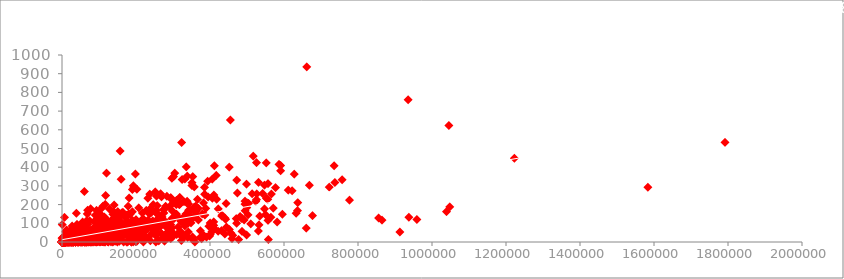
| Category | Votes Vs Revenue (Millions) |
|---|---|
| 757074.0 | 333.13 |
| 485820.0 | 126.46 |
| 157606.0 | 138.12 |
| 60545.0 | 270.32 |
| 393727.0 | 325.02 |
| 56036.0 | 45.13 |
| 258682.0 | 151.06 |
| 2490.0 | 0 |
| 7188.0 | 8.01 |
| 192177.0 | 100.01 |
| 232072.0 | 234.02 |
| 93103.0 | 169.27 |
| 323118.0 | 532.17 |
| 118151.0 | 248.75 |
| 8612.0 | 2.87 |
| 120259.0 | 368.31 |
| 211760.0 | 67.12 |
| 150823.0 | 162.16 |
| 102061.0 | 51.69 |
| 340798.0 | 100.5 |
| 19053.0 | 7.22 |
| 134213.0 | 47.7 |
| 1115.0 | 0 |
| 38552.0 | 153.69 |
| 127553.0 | 103.14 |
| 222.0 | 0 |
| 76193.0 | 6.5 |
| 523.0 | 0.01 |
| 66540.0 | 113.08 |
| 112813.0 | 54.65 |
| 48123.0 | 60.31 |
| 126030.0 | 10.64 |
| 275510.0 | 155.33 |
| 627797.0 | 363.02 |
| 46165.0 | 26.84 |
| 411656.0 | 408.08 |
| 1047747.0 | 187.99 |
| 293732.0 | 232.6 |
| 122853.0 | 93.38 |
| 241.0 | 0 |
| 120690.0 | 97.66 |
| 135095.0 | 27.85 |
| 496.0 | 0 |
| 37033.0 | 12.79 |
| 279.0 | 4.21 |
| 395025.0 | 241.06 |
| 17818.0 | 3.44 |
| 5103.0 | 0 |
| 164567.0 | 158.8 |
| 987.0 | 0 |
| 661608.0 | 936.63 |
| 41362.0 | 30.35 |
| 20221.0 | 32.46 |
| 321933.0 | 43 |
| 1791916.0 | 533.32 |
| 49190.0 | 7.08 |
| 121103.0 | 89.21 |
| 113322.0 | 56.23 |
| 3739.0 | 3.18 |
| 137608.0 | 125.07 |
| 472307.0 | 330.25 |
| 35870.0 | 0 |
| 102177.0 | 75.31 |
| 244474.0 | 166.15 |
| 913152.0 | 53.08 |
| 440209.0 | 128.25 |
| 39784.0 | 31.86 |
| 632842.0 | 153.63 |
| 291.0 | 0.01 |
| 89849.0 | 61.28 |
| 149791.0 | 0 |
| 78079.0 | 40.07 |
| 39134.0 | 3.73 |
| 43977.0 | 30.98 |
| 296853.0 | 341.26 |
| 498821.0 | 309.4 |
| 1045588.0 | 623.28 |
| 959065.0 | 120.52 |
| 552027.0 | 423.03 |
| 147717.0 | 128.34 |
| 1583625.0 | 292.57 |
| 105081.0 | 5.88 |
| 865134.0 | 116.87 |
| 636243.0 | 167.74 |
| 301249.0 | 350.03 |
| 455169.0 | 652.18 |
| 27869.0 | 10.38 |
| 935408.0 | 760.51 |
| 341170.0 | 54.12 |
| 162122.0 | 86.2 |
| 431185.0 | 60.96 |
| 187547.0 | 47.17 |
| 342429.0 | 169.71 |
| 106463.0 | 43.02 |
| 516895.0 | 458.99 |
| 175067.0 | 36.25 |
| 34110.0 | 4.68 |
| 9247.0 | 0.15 |
| 10181.0 | 1.29 |
| 937414.0 | 132.37 |
| 108836.0 | 1.87 |
| 570814.0 | 181.02 |
| 556097.0 | 228.43 |
| 7204.0 | 0 |
| 202973.0 | 45.43 |
| 115546.0 | 26.86 |
| 1954.0 | 1.66 |
| 117590.0 | 126.59 |
| 1004.0 | 0 |
| 339797.0 | 25.44 |
| 3712.0 | 10.16 |
| 486338.0 | 56.67 |
| 512.0 | 0 |
| 637104.0 | 210.59 |
| 590595.0 | 380.96 |
| 30761.0 | 54.73 |
| 50359.0 | 1.33 |
| 48969.0 | 11.15 |
| 192968.0 | 71.9 |
| 157026.0 | 486.29 |
| 101058.0 | 87.24 |
| 362093.0 | 150.83 |
| 53183.0 | 46.01 |
| 10428.0 | 0 |
| 1222645.0 | 448.13 |
| 198243.0 | 364 |
| 255483.0 | 245.43 |
| 69651.0 | 38.56 |
| 153481.0 | 143.7 |
| 499424.0 | 183.64 |
| 50953.0 | 57.64 |
| 109756.0 | 128 |
| 78328.0 | 55.12 |
| 477276.0 | 13.09 |
| 318051.0 | 238.67 |
| 200090.0 | 21.38 |
| 660286.0 | 74.27 |
| 386102.0 | 144.81 |
| 855604.0 | 127.97 |
| 13004.0 | 0 |
| 526324.0 | 257.7 |
| 34184.0 | 64 |
| 246360.0 | 70.24 |
| 224132.0 | 14.68 |
| 1039115.0 | 162.8 |
| 33418.0 | 2.01 |
| 47694.0 | 14.26 |
| 410249.0 | 107.5 |
| 442082.0 | 121.46 |
| 97623.0 | 34.26 |
| 50853.0 | 55.47 |
| 735604.0 | 408 |
| 4299.0 | 0.2 |
| 243230.0 | 46.88 |
| 1973.0 | 0 |
| 97618.0 | 41.8 |
| 400519.0 | 101.79 |
| 396714.0 | 84.24 |
| 291457.0 | 31.49 |
| 373244.0 | 23.62 |
| 5926.0 | 0 |
| 6946.0 | 1.8 |
| 552298.0 | 233.91 |
| 78043.0 | 58.4 |
| 495106.0 | 167.01 |
| 361449.0 | 191.45 |
| 156567.0 | 65.03 |
| 39723.0 | 33.31 |
| 76935.0 | 52.82 |
| 308981.0 | 200.07 |
| 332476.0 | 32.28 |
| 72778.0 | 48.02 |
| 2127.0 | 0 |
| 390531.0 | 25.56 |
| 451894.0 | 400.74 |
| 143069.0 | 93.42 |
| 337777.0 | 208.54 |
| 321442.0 | 110.42 |
| 137203.0 | 102.46 |
| 368912.0 | 180.19 |
| 43086.0 | 24.09 |
| 101781.0 | 25.14 |
| 117018.0 | 201.15 |
| 1176.0 | 0 |
| 22389.0 | 3.4 |
| 24003.0 | 0 |
| 11944.0 | 1.72 |
| 97454.0 | 31.06 |
| 461509.0 | 35.05 |
| 106364.0 | 110.01 |
| 27382.0 | 12.53 |
| 1445.0 | 0 |
| 268282.0 | 44.99 |
| 22107.0 | 3.91 |
| 355722.0 | 13.65 |
| 547368.0 | 176.64 |
| 3799.0 | 0 |
| 459304.0 | 18.35 |
| 532353.0 | 91.12 |
| 97082.0 | 127.38 |
| 471815.0 | 100.19 |
| 12193.0 | 8.1 |
| 79855.0 | 21.48 |
| 737719.0 | 318.3 |
| 70504.0 | 66 |
| 550011.0 | 146.41 |
| 5435.0 | 0.51 |
| 26089.0 | 2.14 |
| 227912.0 | 169.08 |
| 23713.0 | 0 |
| 161396.0 | 155.18 |
| 114290.0 | 14.12 |
| 531112.0 | 318.76 |
| 54679.0 | 0 |
| 443584.0 | 206.36 |
| 73568.0 | 31.14 |
| 542362.0 | 259.75 |
| 7044.0 | 33.04 |
| 1703.0 | 0 |
| 456749.0 | 48.04 |
| 61098.0 | 9.24 |
| 283445.0 | 244.05 |
| 136399.0 | 14.67 |
| 348551.0 | 102.52 |
| 334867.0 | 150.37 |
| 19660.0 | 0.66 |
| 121313.0 | 8.7 |
| 179450.0 | 52 |
| 268877.0 | 241.41 |
| 2382.0 | 0 |
| 498879.0 | 37.62 |
| 3305.0 | 0 |
| 247926.0 | 50.86 |
| 257472.0 | 195 |
| 66766.0 | 47.95 |
| 377336.0 | 17.74 |
| 41446.0 | 13.96 |
| 4895.0 | 2.41 |
| 530881.0 | 59.07 |
| 96852.0 | 26.62 |
| 332234.0 | 85.71 |
| 416689.0 | 356.45 |
| 1109.0 | 9.4 |
| 205365.0 | 89.73 |
| 148949.0 | 88.76 |
| 257426.0 | 148.78 |
| 382910.0 | 35.29 |
| 14708.0 | 5.66 |
| 188017.0 | 110.82 |
| 557965.0 | 13.18 |
| 178.0 | 0.32 |
| 50946.0 | 0.11 |
| 139831.0 | 161.03 |
| 342183.0 | 202.85 |
| 330305.0 | 137.39 |
| 611563.0 | 277.31 |
| 210349.0 | 65.17 |
| 422290.0 | 176.74 |
| 69823.0 | 67.24 |
| 664.0 | 2.27 |
| 440299.0 | 42.34 |
| 581518.0 | 106.95 |
| 21715.0 | 4.4 |
| 90556.0 | 0.79 |
| 59312.0 | 0.54 |
| 53441.0 | 0.03 |
| 75137.0 | 35.54 |
| 298651.0 | 27.1 |
| 388447.0 | 179.88 |
| 2384.0 | 0 |
| 547386.0 | 304.36 |
| 668651.0 | 303 |
| 432046.0 | 138.45 |
| 52144.0 | 3.23 |
| 4729.0 | 0 |
| 410125.0 | 89.02 |
| 280110.0 | 191.62 |
| 329683.0 | 33.05 |
| 36312.0 | 3.37 |
| 591023.0 | 408.99 |
| 492324.0 | 117.7 |
| 501769.0 | 209.02 |
| 220236.0 | 0 |
| 110773.0 | 12.71 |
| 122838.0 | 72.66 |
| 204874.0 | 36.38 |
| 30405.0 | 14.9 |
| 150121.0 | 47.38 |
| 26508.0 | 17.36 |
| 726.0 | 0 |
| 58782.0 | 2.13 |
| 226631.0 | 65 |
| 76327.0 | 55.29 |
| 96.0 | 0 |
| 577010.0 | 291.02 |
| 20514.0 | 18.71 |
| 34523.0 | 64.06 |
| 302268.0 | 124.73 |
| 43929.0 | 15.43 |
| 400682.0 | 40.22 |
| 249425.0 | 101.53 |
| 218996.0 | 125.07 |
| 295554.0 | 42.04 |
| 67033.0 | 48.24 |
| 105619.0 | 31.58 |
| 69509.0 | 8.09 |
| 57207.0 | 77.04 |
| 403.0 | 0 |
| 193479.0 | 62.49 |
| 59886.0 | 46.81 |
| 237221.0 | 255.95 |
| 103150.0 | 2.2 |
| 132580.0 | 0.92 |
| 385598.0 | 255.11 |
| 385325.0 | 292 |
| 199048.0 | 4.56 |
| 73093.0 | 34.91 |
| 1263.0 | 0 |
| 81429.0 | 65.07 |
| 300803.0 | 209.81 |
| 95960.0 | 65.27 |
| 616.0 | 0.01 |
| 203096.0 | 5.69 |
| 319025.0 | 37.55 |
| 510100.0 | 96.92 |
| 71149.0 | 27.36 |
| 37975.0 | 5.77 |
| 12643.0 | 0.04 |
| 62885.0 | 3.22 |
| 43085.0 | 7.1 |
| 34248.0 | 72.66 |
| 353305.0 | 350.12 |
| 352801.0 | 27.3 |
| 207497.0 | 182.2 |
| 339722.0 | 26.9 |
| 18201.0 | 0 |
| 564364.0 | 132.09 |
| 115.0 | 0 |
| 271301.0 | 124.87 |
| 93764.0 | 46.28 |
| 217464.0 | 155.02 |
| 452369.0 | 66.47 |
| 173320.0 | 73.1 |
| 36322.0 | 76.2 |
| 406219.0 | 336.53 |
| 92329.0 | 20.32 |
| 220664.0 | 38.35 |
| 379088.0 | 150.12 |
| 96617.0 | 16.2 |
| 320323.0 | 56.82 |
| 1396.0 | 0 |
| 97679.0 | 56.44 |
| 33352.0 | 2.02 |
| 45579.0 | 11.08 |
| 171970.0 | 130 |
| 59958.0 | 17.18 |
| 5496.0 | 0 |
| 299718.0 | 35.89 |
| 327838.0 | 101.47 |
| 221600.0 | 15.29 |
| 223065.0 | 100.47 |
| 14248.0 | 0.05 |
| 417663.0 | 228.76 |
| 409403.0 | 75.59 |
| 89059.0 | 30 |
| 677044.0 | 141.32 |
| 194329.0 | 292.3 |
| 286.0 | 0 |
| 474320.0 | 262.03 |
| 28326.0 | 26.38 |
| 702.0 | 3.85 |
| 335531.0 | 102.41 |
| 38430.0 | 14.27 |
| 312495.0 | 134.57 |
| 31776.0 | 27.37 |
| 7583.0 | 2.2 |
| 135706.0 | 62.56 |
| 175673.0 | 109.71 |
| 61812.0 | 4.21 |
| 137568.0 | 39.29 |
| 84016.0 | 3.33 |
| 169083.0 | 52.42 |
| 45867.0 | 0 |
| 217938.0 | 72.31 |
| 266508.0 | 257.76 |
| 154647.0 | 43.25 |
| 101092.0 | 78.75 |
| 221117.0 | 105.22 |
| 355362.0 | 132.55 |
| 220667.0 | 73.06 |
| 31913.0 | 20.57 |
| 31194.0 | 10.64 |
| 116112.0 | 17.75 |
| 102.0 | 0 |
| 114482.0 | 133.67 |
| 112288.0 | 42.48 |
| 342355.0 | 134.52 |
| 86417.0 | 109.18 |
| 26587.0 | 0 |
| 113686.0 | 113.71 |
| 159830.0 | 336.03 |
| 240.0 | 0 |
| 93972.0 | 0.1 |
| 410607.0 | 251.5 |
| 49041.0 | 26.76 |
| 40529.0 | 0.23 |
| 226661.0 | 95.72 |
| 316459.0 | 200.81 |
| 202380.0 | 281.67 |
| 74589.0 | 58.88 |
| 502961.0 | 145 |
| 108306.0 | 183.44 |
| 252119.0 | 268.49 |
| 35417.0 | 0 |
| 48161.0 | 21.2 |
| 34546.0 | 1.82 |
| 164.0 | 0 |
| 202890.0 | 50.92 |
| 357213.0 | 294.98 |
| 155010.0 | 4 |
| 164208.0 | 40.25 |
| 8914.0 | 0.04 |
| 35003.0 | 10.91 |
| 237887.0 | 106.37 |
| 100702.0 | 62.4 |
| 485075.0 | 127.49 |
| 122185.0 | 13.75 |
| 525700.0 | 227.14 |
| 43648.0 | 0 |
| 54216.0 | 79 |
| 238789.0 | 6.52 |
| 48297.0 | 28.84 |
| 494819.0 | 202.35 |
| 382459.0 | 209.36 |
| 223.0 | 0 |
| 81301.0 | 0.03 |
| 58421.0 | 37.43 |
| 156189.0 | 19 |
| 214825.0 | 28.75 |
| 220.0 | 0 |
| 181521.0 | 234.9 |
| 94977.0 | 38.32 |
| 156620.0 | 75.28 |
| 151409.0 | 9.7 |
| 4531.0 | 0 |
| 184152.0 | 46.98 |
| 213764.0 | 13.4 |
| 52331.0 | 5.2 |
| 309186.0 | 222.49 |
| 113272.0 | 35.27 |
| 556666.0 | 312.06 |
| 58720.0 | 1.82 |
| 126656.0 | 10.33 |
| 214994.0 | 98.9 |
| 202682.0 | 55.09 |
| 192263.0 | 0.61 |
| 241709.0 | 163.95 |
| 95119.0 | 90.35 |
| 182069.0 | 103.03 |
| 159736.0 | 22.88 |
| 294553.0 | 92.17 |
| 51235.0 | 35.79 |
| 8229.0 | 4.07 |
| 187760.0 | 0 |
| 57602.0 | 80.02 |
| 357436.0 | 186.83 |
| 255813.0 | 118.31 |
| 111558.0 | 1.01 |
| 556794.0 | 115.65 |
| 199900.0 | 119.22 |
| 337835.0 | 130.13 |
| 83941.0 | 15.96 |
| 297984.0 | 166.11 |
| 351059.0 | 301.96 |
| 481274.0 | 136.02 |
| 56332.0 | 15.79 |
| 278103.0 | 11.28 |
| 8404.0 | 0 |
| 61.0 | 0 |
| 41642.0 | 0 |
| 226619.0 | 62.88 |
| 93799.0 | 45.09 |
| 48400.0 | 12.63 |
| 17584.0 | 0 |
| 55781.0 | 107.51 |
| 254446.0 | 45.51 |
| 102954.0 | 118.82 |
| 84765.0 | 71.35 |
| 166489.0 | 53.85 |
| 504039.0 | 206.44 |
| 36091.0 | 0.02 |
| 241359.0 | 94.82 |
| 313803.0 | 80.03 |
| 44553.0 | 28.77 |
| 94707.0 | 2.61 |
| 565721.0 | 256.39 |
| 278379.0 | 179.02 |
| 298913.0 | 126.98 |
| 228339.0 | 73.34 |
| 722203.0 | 292.98 |
| 159364.0 | 81.69 |
| 77995.0 | 0.25 |
| 27428.0 | 0 |
| 52636.0 | 2.7 |
| 166872.0 | 0 |
| 291.0 | 0 |
| 107960.0 | 47.31 |
| 398972.0 | 32.39 |
| 83625.0 | 8.83 |
| 622089.0 | 274.08 |
| 144614.0 | 9.03 |
| 267820.0 | 46.98 |
| 170897.0 | 64.51 |
| 47289.0 | 66.01 |
| 42506.0 | 0 |
| 294950.0 | 58.4 |
| 137299.0 | 65.01 |
| 188769.0 | 31.57 |
| 513744.0 | 258.36 |
| 1356.0 | 0.05 |
| 24100.0 | 2.96 |
| 84927.0 | 16.97 |
| 1830.0 | 23.05 |
| 36156.0 | 0 |
| 36043.0 | 0.06 |
| 552.0 | 93.05 |
| 358932.0 | 0 |
| 26461.0 | 7.19 |
| 318058.0 | 200.66 |
| 245374.0 | 113.17 |
| 74674.0 | 7.46 |
| 12758.0 | 64.03 |
| 253858.0 | 0 |
| 352698.0 | 126.55 |
| 1024.0 | 1.08 |
| 143389.0 | 43.57 |
| 250811.0 | 58.68 |
| 24761.0 | 0.54 |
| 198.0 | 0 |
| 7115.0 | 0 |
| 137964.0 | 15.52 |
| 444417.0 | 79.24 |
| 27042.0 | 0 |
| 177247.0 | 53.68 |
| 4912.0 | 0 |
| 54787.0 | 3.71 |
| 10485.0 | 4.42 |
| 324898.0 | 334.19 |
| 391.0 | 0.11 |
| 22941.0 | 0 |
| 106381.0 | 118.68 |
| 17141.0 | 7.7 |
| 121847.0 | 56.11 |
| 9187.0 | 0 |
| 30074.0 | 0 |
| 30180.0 | 35.39 |
| 96688.0 | 43.77 |
| 148504.0 | 55.94 |
| 90372.0 | 24.99 |
| 115355.0 | 0.44 |
| 283282.0 | 102.98 |
| 133113.0 | 54.24 |
| 171169.0 | 48.06 |
| 290559.0 | 189.41 |
| 239772.0 | 155.11 |
| 47804.0 | 34.96 |
| 338369.0 | 352.36 |
| 432461.0 | 143.49 |
| 26521.0 | 4.2 |
| 68654.0 | 41.01 |
| 110825.0 | 83.91 |
| 150353.0 | 127.71 |
| 159582.0 | 75.27 |
| 374044.0 | 59.89 |
| 11900.0 | 4.85 |
| 238206.0 | 163.19 |
| 44425.0 | 27.55 |
| 273959.0 | 172.05 |
| 525646.0 | 424.65 |
| 44158.0 | 0.58 |
| 6809.0 | 131.56 |
| 125129.0 | 0 |
| 89885.0 | 38.54 |
| 60059.0 | 41.1 |
| 297395.0 | 75.61 |
| 190673.0 | 115.8 |
| 114006.0 | 115.6 |
| 142900.0 | 83.5 |
| 199860.0 | 3.68 |
| 293941.0 | 237.28 |
| 182074.0 | 10.1 |
| 25208.0 | 0.32 |
| 116118.0 | 10.72 |
| 122864.0 | 2.34 |
| 68306.0 | 150.32 |
| 97141.0 | 12.13 |
| 84083.0 | 24.85 |
| 63408.0 | 6.86 |
| 277123.0 | 5.01 |
| 183926.0 | 148.34 |
| 181432.0 | 46 |
| 40357.0 | 93.95 |
| 137684.0 | 0 |
| 89791.0 | 143.52 |
| 1630.0 | 6.53 |
| 338.0 | 0 |
| 116435.0 | 0 |
| 368556.0 | 117.53 |
| 33560.0 | 3.49 |
| 216932.0 | 75.75 |
| 71822.0 | 19.45 |
| 24387.0 | 1.48 |
| 130702.0 | 43.98 |
| 143564.0 | 3.9 |
| 199973.0 | 24.48 |
| 21089.0 | 0.04 |
| 277.0 | 20.76 |
| 29895.0 | 0 |
| 30053.0 | 0.03 |
| 249877.0 | 58.23 |
| 66400.0 | 17.47 |
| 127157.0 | 62.32 |
| 94069.0 | 0.4 |
| 78631.0 | 65 |
| 144715.0 | 89.25 |
| 210965.0 | 58.88 |
| 406540.0 | 234.36 |
| 7181.0 | 0 |
| 10700.0 | 0 |
| 74886.0 | 113.73 |
| 151519.0 | 32.36 |
| 261536.0 | 6.11 |
| 73491.0 | 2.2 |
| 6683.0 | 0 |
| 776897.0 | 223.81 |
| 309398.0 | 148.73 |
| 404884.0 | 54.7 |
| 195360.0 | 37.4 |
| 50402.0 | 31.54 |
| 178471.0 | 56.72 |
| 361105.0 | 162.59 |
| 110100.0 | 3.08 |
| 31149.0 | 0 |
| 4304.0 | 0.86 |
| 3564.0 | 0 |
| 595779.0 | 148.09 |
| 76469.0 | 13.65 |
| 173.0 | 0 |
| 27006.0 | 0.03 |
| 44111.0 | 7.79 |
| 296289.0 | 52.88 |
| 36300.0 | 0 |
| 219916.0 | 53.99 |
| 30875.0 | 9.39 |
| 482.0 | 0 |
| 240323.0 | 97.03 |
| 286722.0 | 25.36 |
| 178527.0 | 190.87 |
| 198006.0 | 17.11 |
| 2798.0 | 0.03 |
| 267872.0 | 87.34 |
| 54027.0 | 0.02 |
| 206707.0 | 20.3 |
| 140151.0 | 159.58 |
| 5796.0 | 0.28 |
| 75291.0 | 12.8 |
| 26320.0 | 0.05 |
| 136323.0 | 81.26 |
| 168875.0 | 49.87 |
| 422014.0 | 57.37 |
| 15514.0 | 0 |
| 47703.0 | 1.21 |
| 352023.0 | 15.7 |
| 231907.0 | 116.59 |
| 9285.0 | 0 |
| 233346.0 | 25.59 |
| 188004.0 | 25.12 |
| 80415.0 | 0.01 |
| 57874.0 | 34.02 |
| 2403.0 | 0.54 |
| 331902.0 | 337.1 |
| 104953.0 | 1.74 |
| 16164.0 | 14.01 |
| 112313.0 | 31.17 |
| 245144.0 | 69.95 |
| 534388.0 | 138.8 |
| 54486.0 | 0.15 |
| 252503.0 | 80.17 |
| 586669.0 | 414.98 |
| 157053.0 | 24.1 |
| 114144.0 | 42.35 |
| 23540.0 | 1.4 |
| 10708.0 | 1.36 |
| 90188.0 | 23.22 |
| 471109.0 | 124.98 |
| 177602.0 | 0 |
| 19636.0 | 0.2 |
| 86271.0 | 0.33 |
| 347567.0 | 134.52 |
| 1427.0 | 0 |
| 73835.0 | 1.29 |
| 494641.0 | 218.63 |
| 250012.0 | 90.36 |
| 106115.0 | 49.55 |
| 83788.0 | 23.23 |
| 4754.0 | 0 |
| 208632.0 | 62.45 |
| 5908.0 | 1.02 |
| 146812.0 | 47.11 |
| 18437.0 | 5.73 |
| 335757.0 | 402.08 |
| 11482.0 | 0.92 |
| 50388.0 | 50.15 |
| 92863.0 | 6.86 |
| 74664.0 | 36.77 |
| 141141.0 | 197.99 |
| 64557.0 | 32.36 |
| 96718.0 | 52.53 |
| 209700.0 | 101.16 |
| 236500.0 | 150.06 |
| 65824.0 | 0.33 |
| 95553.0 | 37.88 |
| 190385.0 | 162 |
| 26088.0 | 20.75 |
| 127983.0 | 176.59 |
| 209326.0 | 79.71 |
| 286543.0 | 55.8 |
| 309934.0 | 39.83 |
| 219116.0 | 77.21 |
| 71069.0 | 0.32 |
| 166342.0 | 44.67 |
| 201707.0 | 37.37 |
| 688.0 | 0 |
| 338280.0 | 217.54 |
| 16163.0 | 0.69 |
| 259182.0 | 73.82 |
| 4155.0 | 0.02 |
| 182305.0 | 39.38 |
| 17439.0 | 0.56 |
| 124554.0 | 102.18 |
| 29642.0 | 63.03 |
| 8998.0 | 4.71 |
| 144524.0 | 20.17 |
| 254904.0 | 171.03 |
| 25903.0 | 3.59 |
| 144779.0 | 42.62 |
| 313.0 | 0 |
| 3731.0 | 3.65 |
| 30035.0 | 34.9 |
| 91684.0 | 68.56 |
| 148943.0 | 39 |
| 92875.0 | 27.69 |
| 322536.0 | 7.76 |
| 154400.0 | 54.76 |
| 353.0 | 0 |
| 187302.0 | 0.06 |
| 2083.0 | 0 |
| 256.0 | 0 |
| 84893.0 | 21.27 |
| 290056.0 | 93.57 |
| 91229.0 | 31.66 |
| 151970.0 | 31.24 |
| 57826.0 | 18.7 |
| 156158.0 | 101.11 |
| 154588.0 | 64.42 |
| 103279.0 | 10.57 |
| 194236.0 | 61.66 |
| 351361.0 | 317.01 |
| 72515.0 | 31.99 |
| 25928.0 | 0.34 |
| 347798.0 | 168.37 |
| 2043.0 | 0 |
| 523893.0 | 217.39 |
| 82701.0 | 42.27 |
| 199193.0 | 10.14 |
| 110490.0 | 191.45 |
| 10871.0 | 0.78 |
| 9026.0 | 0 |
| 499.0 | 0 |
| 29912.0 | 3.86 |
| 218679.0 | 61.09 |
| 67196.0 | 12.28 |
| 128146.0 | 28.48 |
| 1031.0 | 0 |
| 31370.0 | 0.04 |
| 346154.0 | 107.1 |
| 378.0 | 0 |
| 11555.0 | 3.77 |
| 69157.0 | 169.69 |
| 366138.0 | 227.95 |
| 50241.0 | 87.03 |
| 92868.0 | 36.92 |
| 154936.0 | 31.45 |
| 4370.0 | 0.29 |
| 129252.0 | 18.6 |
| 178243.0 | 70.63 |
| 87887.0 | 5.48 |
| 304837.0 | 368.05 |
| 93883.0 | 25.98 |
| 199813.0 | 26 |
| 7091.0 | 0 |
| 196652.0 | 14.99 |
| 146566.0 | 82.16 |
| 103681.0 | 50.55 |
| 221073.0 | 71.98 |
| 52537.0 | 33.63 |
| 233148.0 | 90.76 |
| 115751.0 | 6.85 |
| 4771.0 | 3.9 |
| 4964.0 | 0 |
| 19309.0 | 0.05 |
| 142560.0 | 71.59 |
| 153448.0 | 41.57 |
| 72050.0 | 16.68 |
| 149779.0 | 21 |
| 285441.0 | 88.5 |
| 8755.0 | 0 |
| 294010.0 | 18.33 |
| 91106.0 | 84.26 |
| 564.0 | 0 |
| 13711.0 | 0 |
| 130153.0 | 7.69 |
| 180105.0 | 150.17 |
| 5855.0 | 0.3 |
| 4779.0 | 0 |
| 1427.0 | 0 |
| 5715.0 | 6.88 |
| 1391.0 | 0 |
| 160350.0 | 25.03 |
| 77207.0 | 14.17 |
| 171356.0 | 70.27 |
| 16917.0 | 49 |
| 67464.0 | 11.23 |
| 62719.0 | 70.22 |
| 225394.0 | 59.62 |
| 38804.0 | 5.98 |
| 5531.0 | 0.13 |
| 163144.0 | 100.02 |
| 8409.0 | 0 |
| 346.0 | 0 |
| 125190.0 | 54.41 |
| 15232.0 | 1.98 |
| 137117.0 | 3.03 |
| 95480.0 | 104.37 |
| 157499.0 | 81.56 |
| 276347.0 | 93.75 |
| 77447.0 | 177.34 |
| 77986.0 | 0.09 |
| 1066.0 | 0 |
| 69659.0 | 95 |
| 198395.0 | 81.16 |
| 111875.0 | 16.17 |
| 88829.0 | 11.33 |
| 208770.0 | 23.21 |
| 329788.0 | 215.4 |
| 9993.0 | 54.01 |
| 297093.0 | 125.32 |
| 55648.0 | 36.58 |
| 136642.0 | 41.78 |
| 206793.0 | 35.71 |
| 119376.0 | 19.06 |
| 2421.0 | 0 |
| 32310.0 | 66.95 |
| 100890.0 | 1.36 |
| 6175.0 | 0 |
| 61060.0 | 0.16 |
| 7402.0 | 3.4 |
| 20907.0 | 0.64 |
| 20194.0 | 52.69 |
| 270429.0 | 133.38 |
| 21569.0 | 3.36 |
| 59512.0 | 9.35 |
| 64584.0 | 44.8 |
| 113599.0 | 13.77 |
| 101301.0 | 53.36 |
| 221858.0 | 28.64 |
| 193579.0 | 66.36 |
| 160592.0 | 33.4 |
| 152145.0 | 122.51 |
| 159230.0 | 83.64 |
| 8365.0 | 1.91 |
| 125693.0 | 83.3 |
| 184564.0 | 23.01 |
| 173919.0 | 143.62 |
| 16361.0 | 0.03 |
| 253417.0 | 34.3 |
| 143517.0 | 13.3 |
| 82874.0 | 60.44 |
| 75262.0 | 25 |
| 281625.0 | 34.96 |
| 202.0 | 0 |
| 108156.0 | 67.52 |
| 264480.0 | 85.46 |
| 102547.0 | 152.64 |
| 187077.0 | 42.72 |
| 174553.0 | 0 |
| 61274.0 | 34.53 |
| 93036.0 | 2.28 |
| 172558.0 | 88.92 |
| 83976.0 | 58.72 |
| 27730.0 | 0.81 |
| 118905.0 | 34.01 |
| 55243.0 | 3.45 |
| 237565.0 | 177 |
| 190833.0 | 58.61 |
| 1455.0 | 0 |
| 12361.0 | 14.44 |
| 269581.0 | 117.14 |
| 64351.0 | 7.77 |
| 187004.0 | 75.64 |
| 17565.0 | 0.08 |
| 4204.0 | 0 |
| 117297.0 | 82.23 |
| 66265.0 | 0.07 |
| 33007.0 | 36.84 |
| 17962.0 | 0.79 |
| 257395.0 | 85.02 |
| 19351.0 | 0 |
| 199387.0 | 2.21 |
| 155078.0 | 70.08 |
| 67801.0 | 0.12 |
| 31651.0 | 3.64 |
| 152808.0 | 64.15 |
| 57921.0 | 27.29 |
| 246797.0 | 200.07 |
| 190244.0 | 281.28 |
| 91623.0 | 47.54 |
| 7475.0 | 0.02 |
| 3843.0 | 0 |
| 112902.0 | 16.38 |
| 39380.0 | 51.78 |
| 92170.0 | 50.46 |
| 924.0 | 0 |
| 2205.0 | 0 |
| 4669.0 | 0.22 |
| 137502.0 | 148.21 |
| 60655.0 | 0.18 |
| 64535.0 | 0.32 |
| 14689.0 | 0 |
| 279694.0 | 83.81 |
| 50255.0 | 0.07 |
| 192740.0 | 300.52 |
| 1292.0 | 0 |
| 62095.0 | 13.99 |
| 132098.0 | 42 |
| 72533.0 | 0 |
| 93322.0 | 116.63 |
| 3990.0 | 0.03 |
| 166512.0 | 60.52 |
| 2417.0 | 0.15 |
| 92076.0 | 6.74 |
| 211348.0 | 82.62 |
| 62403.0 | 95.33 |
| 65653.0 | 1.29 |
| 173731.0 | 36.06 |
| 81823.0 | 26.05 |
| 84158.0 | 40.17 |
| 192190.0 | 40.98 |
| 73567.0 | 30.69 |
| 271940.0 | 22.49 |
| 97141.0 | 2.32 |
| 10220.0 | 0.01 |
| 88260.0 | 26.81 |
| 60133.0 | 0.09 |
| 280.0 | 0 |
| 44227.0 | 0 |
| 1810.0 | 0 |
| 92378.0 | 10.14 |
| 1210.0 | 0 |
| 190855.0 | 89.29 |
| 37060.0 | 34.33 |
| 193491.0 | 80.05 |
| 64513.0 | 38.51 |
| 108544.0 | 38.18 |
| 6753.0 | 8.81 |
| 20966.0 | 59.57 |
| 31634.0 | 0 |
| 2229.0 | 0 |
| 10658.0 | 0 |
| 108772.0 | 3.19 |
| 12048.0 | 61.69 |
| 27312.0 | 85.91 |
| 95172.0 | 24.34 |
| 112729.0 | 82.39 |
| 21405.0 | 42.65 |
| 87904.0 | 21.56 |
| 88000.0 | 42.58 |
| 33688.0 | 23.39 |
| 63785.0 | 0 |
| 67637.0 | 52.07 |
| 129708.0 | 45.8 |
| 102697.0 | 1.2 |
| 45419.0 | 6.92 |
| 140900.0 | 60.13 |
| 164088.0 | 54.72 |
| 27585.0 | 0 |
| 73152.0 | 17.54 |
| 70699.0 | 58.01 |
| 4881.0 | 0 |
| 12435.0 | 19.64 |